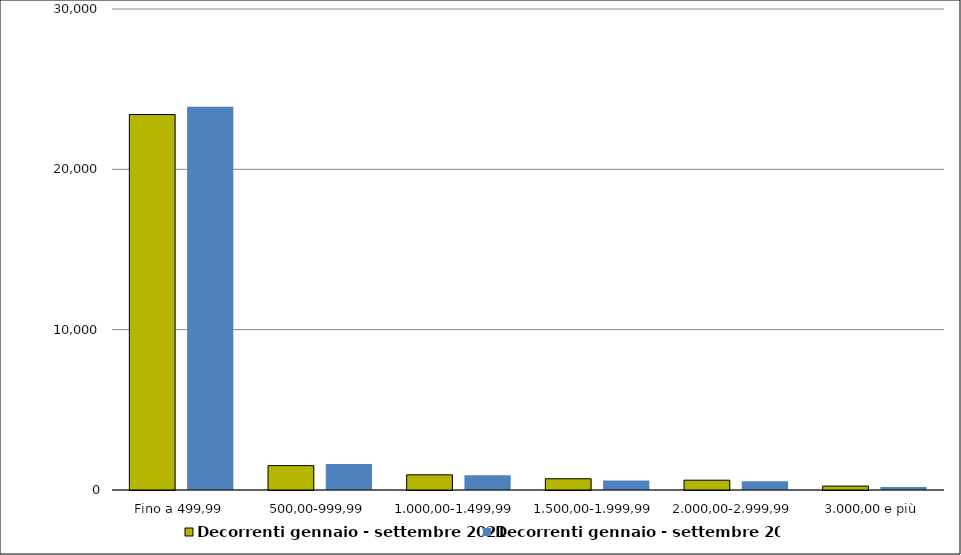
| Category | Decorrenti gennaio - settembre 2021 | Decorrenti gennaio - settembre 2020 |
|---|---|---|
|  Fino a 499,99  | 23418 | 23897 |
|  500,00-999,99  | 1520 | 1620 |
|  1.000,00-1.499,99  | 947 | 921 |
|  1.500,00-1.999,99  | 701 | 586 |
|  2.000,00-2.999,99  | 612 | 542 |
|  3.000,00 e più  | 245 | 188 |